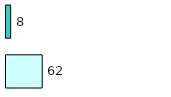
| Category | Series 0 | Series 1 |
|---|---|---|
| 0 | 62 | 8 |